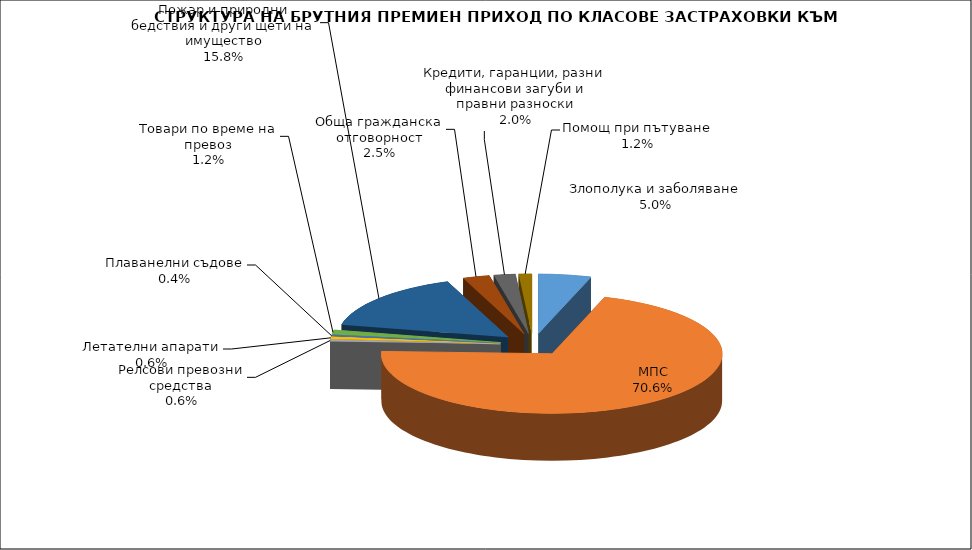
| Category | Злополука и заболяване |
|---|---|
| Злополука и заболяване | 0.05 |
| МПС | 0.706 |
| Релсови превозни средства | 0.006 |
| Летателни апарати | 0.006 |
| Плаванелни съдове | 0.004 |
| Товари по време на превоз | 0.012 |
| Пожар и природни бедствия и други щети на имущество | 0.158 |
| Обща гражданска отговорност | 0.025 |
| Кредити, гаранции, разни финансови загуби и правни разноски | 0.02 |
| Помощ при пътуване | 0.012 |